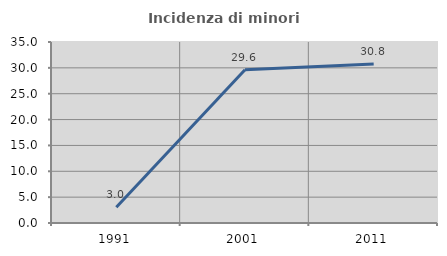
| Category | Incidenza di minori stranieri |
|---|---|
| 1991.0 | 3.03 |
| 2001.0 | 29.618 |
| 2011.0 | 30.769 |